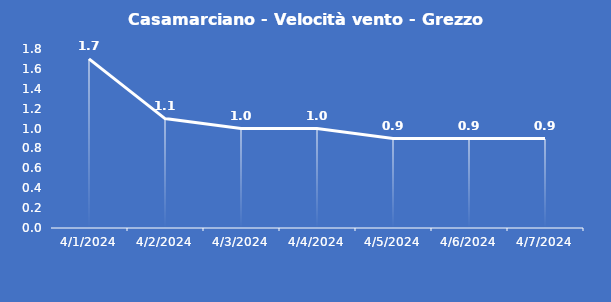
| Category | Casamarciano - Velocità vento - Grezzo (m/s) |
|---|---|
| 4/1/24 | 1.7 |
| 4/2/24 | 1.1 |
| 4/3/24 | 1 |
| 4/4/24 | 1 |
| 4/5/24 | 0.9 |
| 4/6/24 | 0.9 |
| 4/7/24 | 0.9 |